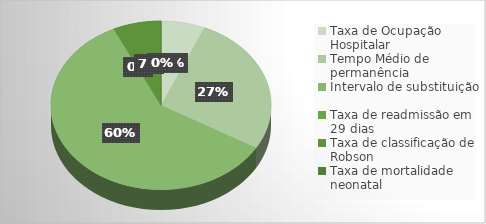
| Category | Series 0 |
|---|---|
| Taxa de Ocupação Hospitalar | 0.916 |
| Tempo Médio de permanência | 3.83 |
| Intervalo de substituição | 8.45 |
| Taxa de readmissão em 29 dias | 0 |
| Taxa de classificação de Robson | 1 |
| Taxa de mortalidade neonatal | 0 |